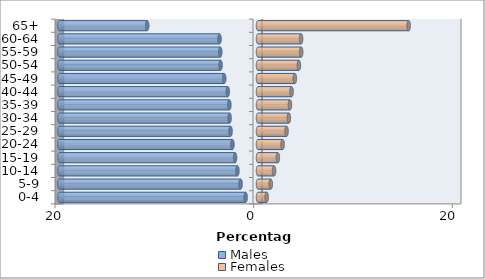
| Category | Males | Females |
|---|---|---|
| 0-4 | -1.244 | 0.873 |
| 5-9 | -1.75 | 1.284 |
| 10-14 | -2.073 | 1.616 |
| 15-19 | -2.308 | 1.999 |
| 20-24 | -2.574 | 2.477 |
| 25-29 | -2.764 | 2.874 |
| 30-34 | -2.858 | 3.109 |
| 35-39 | -2.883 | 3.215 |
| 40-44 | -3.045 | 3.381 |
| 45-49 | -3.398 | 3.709 |
| 50-54 | -3.769 | 4.118 |
| 55-59 | -3.798 | 4.345 |
| 60-64 | -3.875 | 4.339 |
| 65+ | -11.157 | 15.166 |